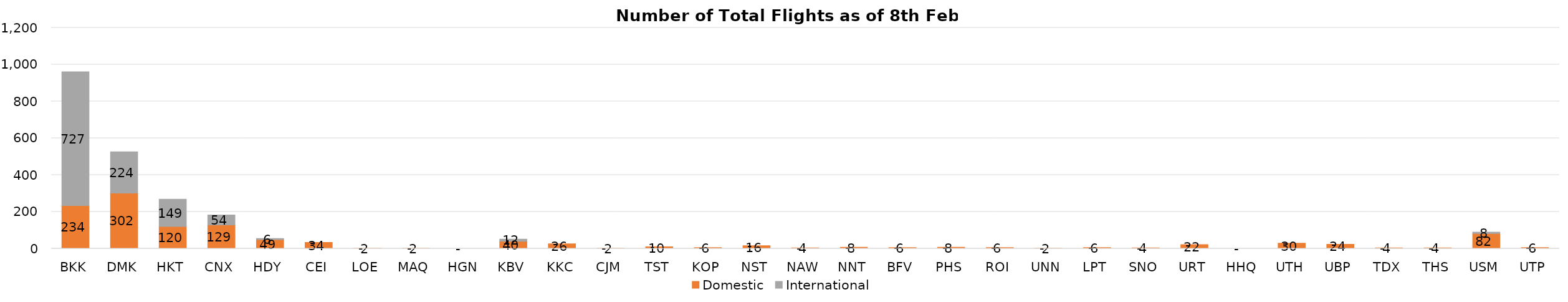
| Category | Domestic | International |
|---|---|---|
| BKK | 234 | 727 |
| DMK | 302 | 224 |
| HKT | 120 | 149 |
| CNX | 129 | 54 |
| HDY | 49 | 6 |
| CEI | 34 | 0 |
| LOE | 2 | 0 |
| MAQ | 2 | 0 |
| HGN | 0 | 0 |
| KBV | 40 | 12 |
| KKC | 26 | 0 |
| CJM | 2 | 0 |
| TST | 10 | 0 |
| KOP | 6 | 0 |
| NST | 16 | 0 |
| NAW | 4 | 0 |
| NNT | 8 | 0 |
| BFV | 6 | 0 |
| PHS | 8 | 0 |
| ROI | 6 | 0 |
| UNN | 2 | 0 |
| LPT | 6 | 0 |
| SNO | 4 | 0 |
| URT | 22 | 0 |
| HHQ | 0 | 0 |
| UTH | 30 | 0 |
| UBP | 24 | 0 |
| TDX | 4 | 0 |
| THS | 4 | 0 |
| USM | 82 | 8 |
| UTP | 6 | 0 |